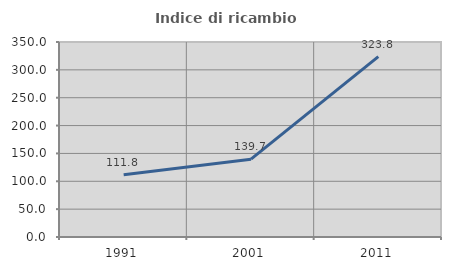
| Category | Indice di ricambio occupazionale  |
|---|---|
| 1991.0 | 111.816 |
| 2001.0 | 139.731 |
| 2011.0 | 323.78 |